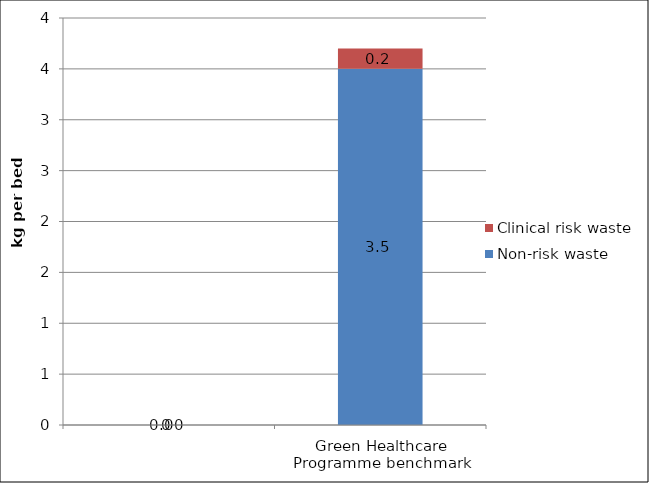
| Category | Non-risk waste | Clinical risk waste |
|---|---|---|
|  | 0 | 0 |
| Green Healthcare Programme benchmark | 3.5 | 0.2 |